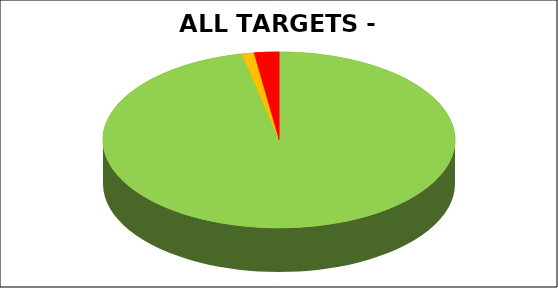
| Category | Series 0 |
|---|---|
| Green | 0.966 |
| Amber | 0.011 |
| Red | 0.023 |